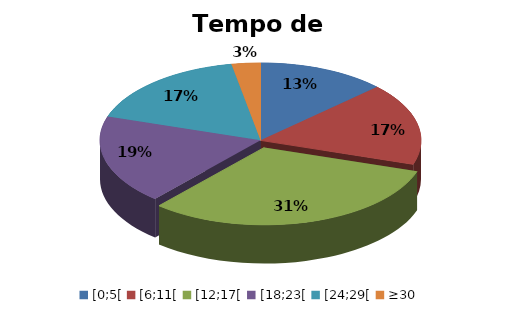
| Category | Series 0 |
|---|---|
| [0;5[ | 0.129 |
| [6;11[ | 0.171 |
| [12;17[ | 0.314 |
| [18;23[ | 0.186 |
| [24;29[ | 0.171 |
| ≥30 | 0.029 |